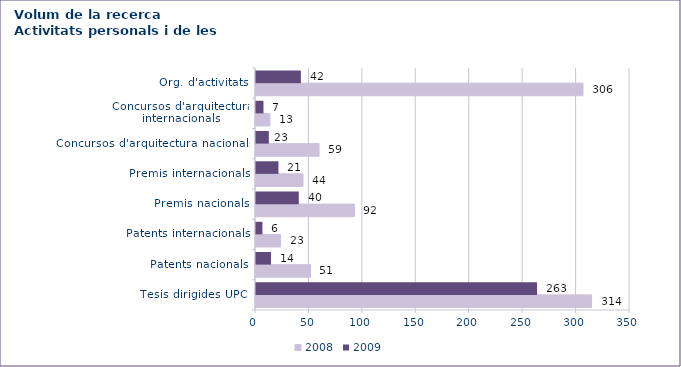
| Category | 2008 | 2009 |
|---|---|---|
| Tesis dirigides UPC  | 314 | 263 |
| Patents nacionals | 51 | 14 |
| Patents internacionals | 23 | 6 |
| Premis nacionals | 92 | 40 |
| Premis internacionals | 44 | 21 |
| Concursos d'arquitectura nacionals | 59 | 12 |
| Concursos d'arquitectura internacionals | 13 | 7 |
| Org. d'activitats | 306 | 42 |